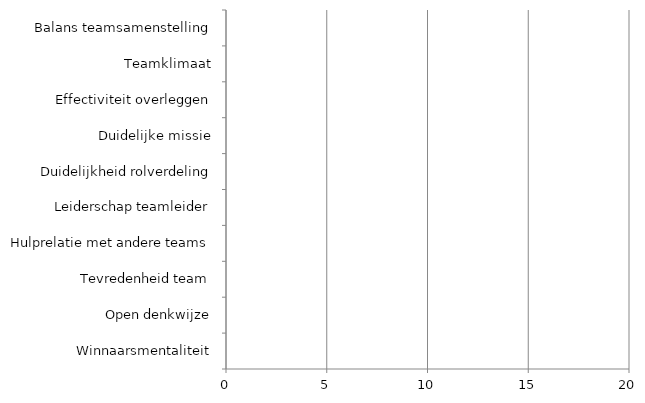
| Category | Series 0 |
|---|---|
| Winnaarsmentaliteit | 0 |
| Open denkwijze | 0 |
| Tevredenheid team | 0 |
| Hulprelatie met andere teams | 0 |
| Leiderschap teamleider | 0 |
| Duidelijkheid rolverdeling | 0 |
| Duidelijke missie | 0 |
| Effectiviteit overleggen | 0 |
| Teamklimaat | 0 |
| Balans teamsamenstelling | 0 |